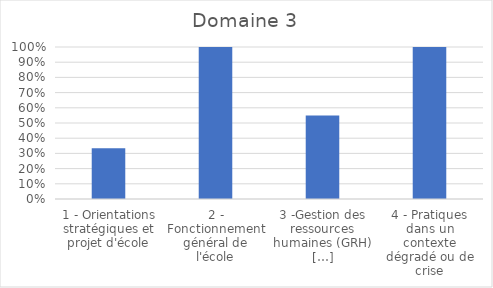
| Category | Series 0 |
|---|---|
| 1 - Orientations stratégiques et projet d'école | 0.333 |
| 2 - Fonctionnement général de l'école | 1 |
| 3 -Gestion des ressources humaines (GRH) […] | 0.55 |
| 4 - Pratiques dans un contexte dégradé ou de crise | 1 |